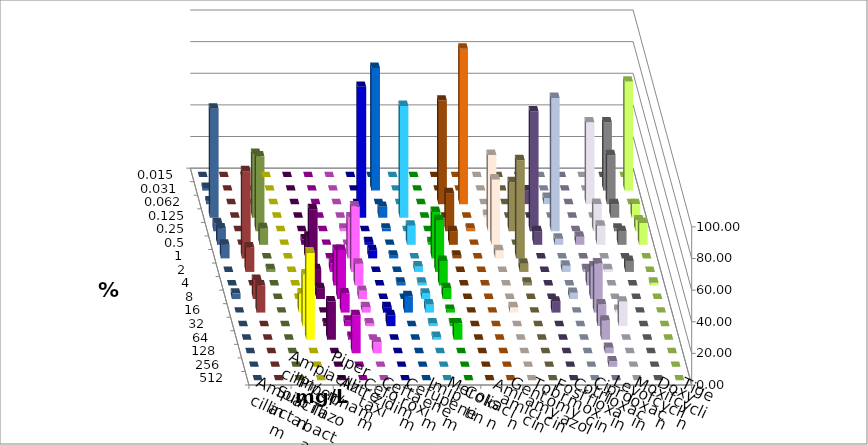
| Category | Ampicillin | Ampicillin/ Sulbactam | Piperacillin | Piperacillin/ Tazobactam | Aztreonam | Cefotaxim | Ceftazidim | Cefuroxim | Imipenem | Meropenem | Colistin | Amikacin | Gentamicin | Tobramycin | Fosfomycin | Cotrimoxazol | Ciprofloxacin | Levofloxacin | Moxifloxacin | Doxycyclin | Tigecyclin |
|---|---|---|---|---|---|---|---|---|---|---|---|---|---|---|---|---|---|---|---|---|---|
| 0.015 | 0 | 0 | 0 | 0 | 0 | 0 | 0 | 0 | 0 | 0 | 0 | 0 | 0 | 0 | 0 | 0 | 0 | 0 | 0 | 0 | 0 |
| 0.031 | 0 | 0 | 0 | 0 | 0 | 77.586 | 0 | 0 | 0 | 0 | 0 | 0 | 0 | 0 | 0 | 0 | 43.103 | 68.966 | 1.724 | 0 | 0 |
| 0.062 | 0 | 0 | 0 | 0 | 0 | 0 | 0 | 0 | 65.517 | 98.276 | 0 | 0 | 8.621 | 3.922 | 0 | 51.724 | 31.034 | 0 | 1.724 | 0 | 0 |
| 0.125 | 0 | 0 | 0 | 0 | 82.759 | 6.897 | 70.69 | 0 | 0 | 0 | 1.724 | 0 | 0 | 0 | 0 | 0 | 8.621 | 8.621 | 68.966 | 0 | 40.351 |
| 0.25 | 0 | 0 | 0 | 1.724 | 0 | 1.724 | 0 | 0 | 24.138 | 1.724 | 48.276 | 31.034 | 75.862 | 84.314 | 0 | 17.241 | 1.724 | 6.897 | 5.172 | 0 | 47.368 |
| 0.5 | 0 | 3.448 | 0 | 0 | 1.724 | 0 | 12.069 | 1.724 | 8.621 | 0 | 41.379 | 0 | 8.621 | 3.922 | 5.172 | 12.069 | 8.621 | 13.793 | 10.345 | 0 | 10.526 |
| 1.0 | 0 | 13.793 | 0 | 25.862 | 5.172 | 1.724 | 0 | 29.31 | 1.724 | 0 | 5.172 | 62.069 | 0 | 0 | 0 | 0 | 0 | 0 | 8.621 | 55.172 | 0 |
| 2.0 | 0 | 39.655 | 5.172 | 41.379 | 0 | 0 | 3.448 | 32.759 | 0 | 0 | 0 | 5.172 | 0 | 3.922 | 1.724 | 1.724 | 6.897 | 0 | 0 | 15.517 | 1.754 |
| 4.0 | 0 | 10.345 | 22.414 | 13.793 | 0 | 1.724 | 1.724 | 15.517 | 0 | 0 | 0 | 1.724 | 0 | 0 | 8.621 | 0 | 0 | 1.724 | 0 | 0 | 0 |
| 8.0 | 0 | 6.897 | 31.034 | 5.172 | 0 | 0 | 3.448 | 6.897 | 0 | 0 | 0 | 0 | 0 | 3.922 | 20.69 | 0 | 0 | 0 | 3.448 | 12.069 | 0 |
| 16.0 | 12.069 | 0 | 12.069 | 3.448 | 3.448 | 10.345 | 5.172 | 1.724 | 0 | 0 | 3.448 | 0 | 6.897 | 0 | 31.034 | 1.724 | 0 | 0 | 0 | 17.241 | 0 |
| 32.0 | 32.759 | 1.724 | 3.448 | 1.724 | 6.897 | 0 | 1.724 | 1.724 | 0 | 0 | 0 | 0 | 0 | 0 | 13.793 | 15.517 | 0 | 0 | 0 | 0 | 0 |
| 64.0 | 55.172 | 24.138 | 1.724 | 0 | 0 | 0 | 1.724 | 10.345 | 0 | 0 | 0 | 0 | 0 | 0 | 12.069 | 0 | 0 | 0 | 0 | 0 | 0 |
| 128.0 | 0 | 0 | 24.138 | 6.897 | 0 | 0 | 0 | 0 | 0 | 0 | 0 | 0 | 0 | 0 | 3.448 | 0 | 0 | 0 | 0 | 0 | 0 |
| 256.0 | 0 | 0 | 0 | 0 | 0 | 0 | 0 | 0 | 0 | 0 | 0 | 0 | 0 | 0 | 3.448 | 0 | 0 | 0 | 0 | 0 | 0 |
| 512.0 | 0 | 0 | 0 | 0 | 0 | 0 | 0 | 0 | 0 | 0 | 0 | 0 | 0 | 0 | 0 | 0 | 0 | 0 | 0 | 0 | 0 |